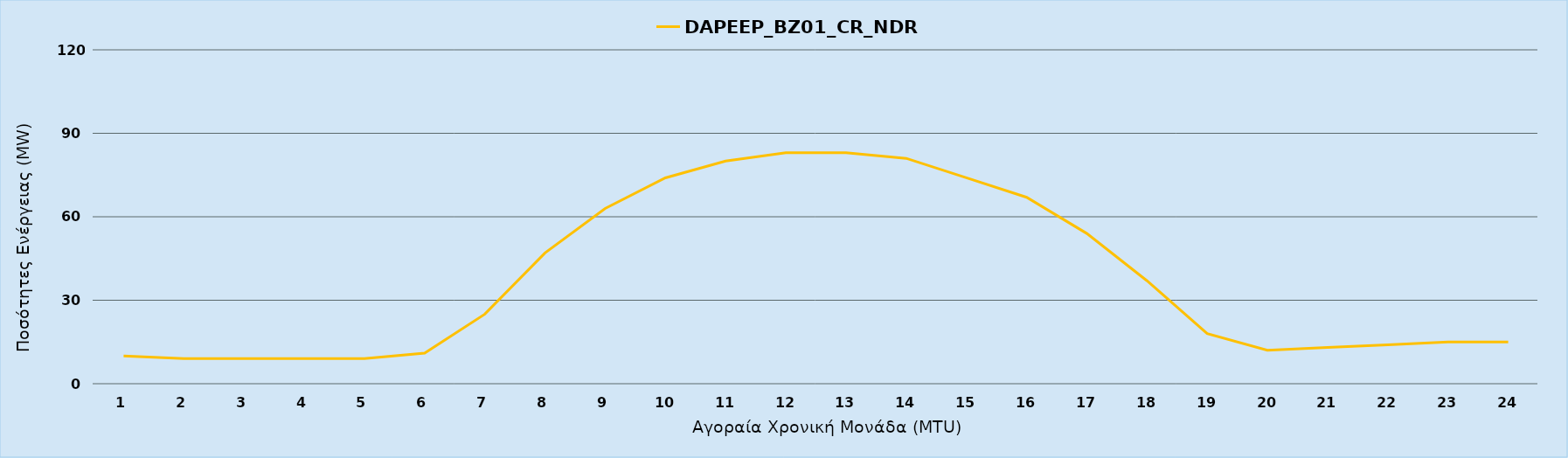
| Category | DAPEEP_BZ01_CR_NDR |
|---|---|
| 0 | 10 |
| 1 | 9 |
| 2 | 9 |
| 3 | 9 |
| 4 | 9 |
| 5 | 11 |
| 6 | 25 |
| 7 | 47 |
| 8 | 63 |
| 9 | 74 |
| 10 | 80 |
| 11 | 83 |
| 12 | 83 |
| 13 | 81 |
| 14 | 74 |
| 15 | 67 |
| 16 | 54 |
| 17 | 37 |
| 18 | 18 |
| 19 | 12 |
| 20 | 13 |
| 21 | 14 |
| 22 | 15 |
| 23 | 15 |